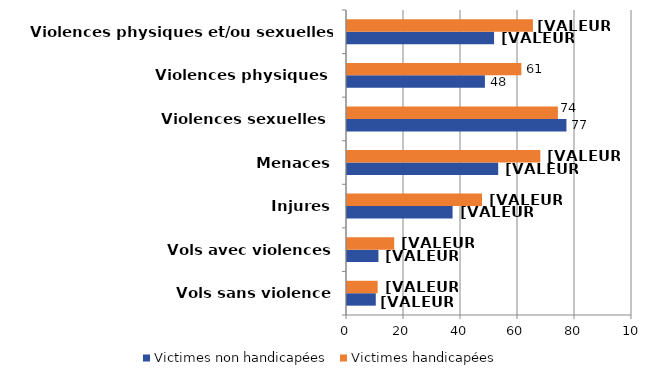
| Category | Victimes non handicapées | Victimes handicapées |
|---|---|---|
| Vols sans violence | 10.099 | 10.757 |
| Vols avec violences | 11.03 | 16.574 |
| Injures | 37.04 | 47.371 |
| Menaces | 53.05 | 67.839 |
| Violences sexuelles  | 77 | 74 |
| Violences physiques  | 48.388 | 61.178 |
| Violences physiques et/ou sexuelles, dont : | 51.601 | 65.243 |